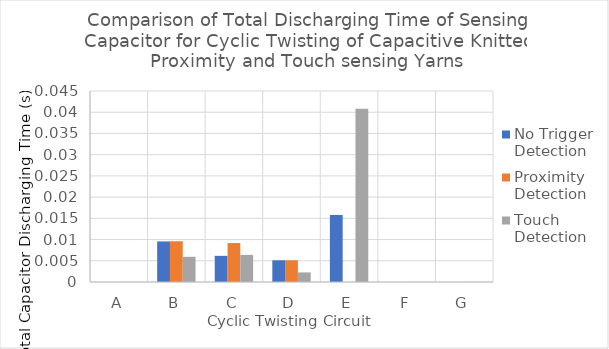
| Category | No Trigger Detection | Proximity Detection | Touch Detection |
|---|---|---|---|
| A | 0 | 0 | 0 |
| B | 0.01 | 0.01 | 0.006 |
| C | 0.006 | 0.009 | 0.006 |
| D | 0.005 | 0.005 | 0.002 |
| E | 0.016 | 0 | 0.041 |
| F | 0 | 0 | 0 |
| G | 0 | 0 | 0 |